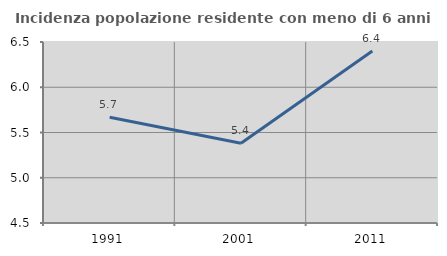
| Category | Incidenza popolazione residente con meno di 6 anni |
|---|---|
| 1991.0 | 5.669 |
| 2001.0 | 5.382 |
| 2011.0 | 6.4 |